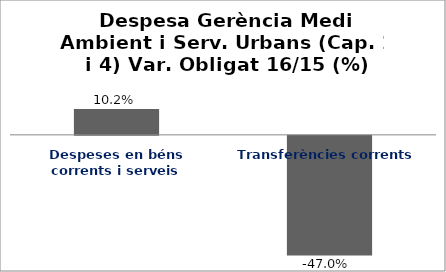
| Category | Series 0 |
|---|---|
| Despeses en béns corrents i serveis | 0.102 |
| Transferències corrents | -0.47 |